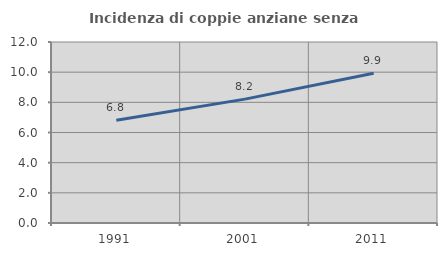
| Category | Incidenza di coppie anziane senza figli  |
|---|---|
| 1991.0 | 6.809 |
| 2001.0 | 8.213 |
| 2011.0 | 9.926 |